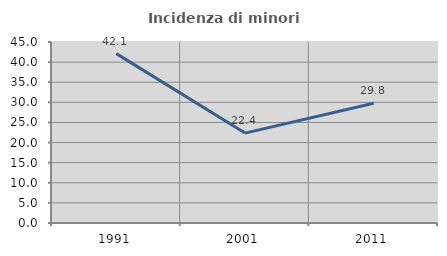
| Category | Incidenza di minori stranieri |
|---|---|
| 1991.0 | 42.105 |
| 2001.0 | 22.353 |
| 2011.0 | 29.767 |